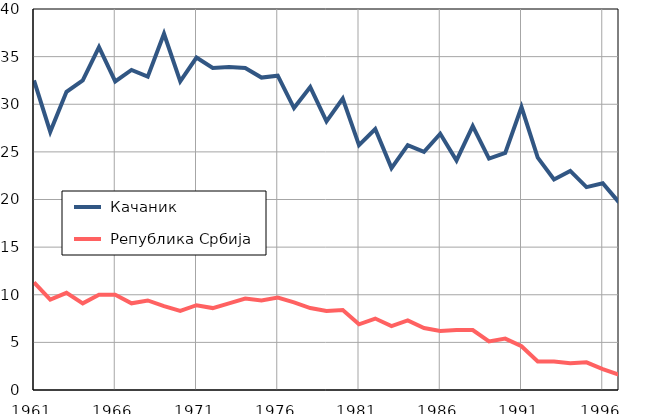
| Category |  Качаник |  Република Србија |
|---|---|---|
| 1961.0 | 32.5 | 11.3 |
| 1962.0 | 27.1 | 9.5 |
| 1963.0 | 31.3 | 10.2 |
| 1964.0 | 32.5 | 9.1 |
| 1965.0 | 36 | 10 |
| 1966.0 | 32.4 | 10 |
| 1967.0 | 33.6 | 9.1 |
| 1968.0 | 32.9 | 9.4 |
| 1969.0 | 37.4 | 8.8 |
| 1970.0 | 32.4 | 8.3 |
| 1971.0 | 34.9 | 8.9 |
| 1972.0 | 33.8 | 8.6 |
| 1973.0 | 33.9 | 9.1 |
| 1974.0 | 33.8 | 9.6 |
| 1975.0 | 32.8 | 9.4 |
| 1976.0 | 33 | 9.7 |
| 1977.0 | 29.6 | 9.2 |
| 1978.0 | 31.8 | 8.6 |
| 1979.0 | 28.2 | 8.3 |
| 1980.0 | 30.6 | 8.4 |
| 1981.0 | 25.7 | 6.9 |
| 1982.0 | 27.4 | 7.5 |
| 1983.0 | 23.3 | 6.7 |
| 1984.0 | 25.7 | 7.3 |
| 1985.0 | 25 | 6.5 |
| 1986.0 | 26.9 | 6.2 |
| 1987.0 | 24.1 | 6.3 |
| 1988.0 | 27.7 | 6.3 |
| 1989.0 | 24.3 | 5.1 |
| 1990.0 | 24.9 | 5.4 |
| 1991.0 | 29.7 | 4.6 |
| 1992.0 | 24.4 | 3 |
| 1993.0 | 22.1 | 3 |
| 1994.0 | 23 | 2.8 |
| 1995.0 | 21.3 | 2.9 |
| 1996.0 | 21.7 | 2.2 |
| 1997.0 | 19.7 | 1.6 |